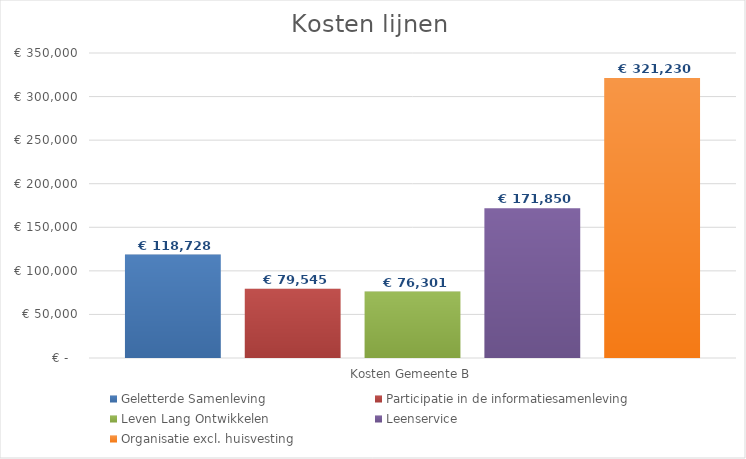
| Category | Geletterde Samenleving | Participatie in de informatiesamenleving | Leven Lang Ontwikkelen | Leenservice | Organisatie excl. huisvesting |
|---|---|---|---|---|---|
| Kosten Gemeente B | 118728.293 | 79545.463 | 76300.512 | 171850.455 | 321229.77 |